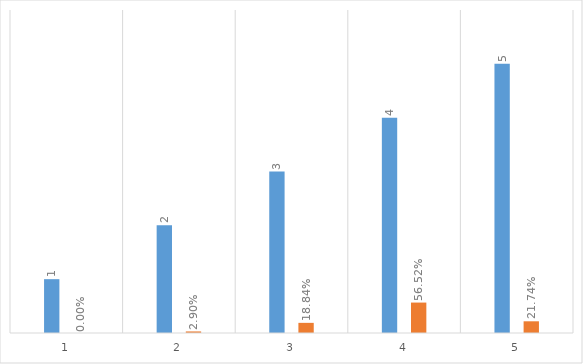
| Category | Series 0 | Series 1 |
|---|---|---|
| 0 | 1 | 0 |
| 1 | 2 | 0.029 |
| 2 | 3 | 0.188 |
| 3 | 4 | 0.565 |
| 4 | 5 | 0.217 |